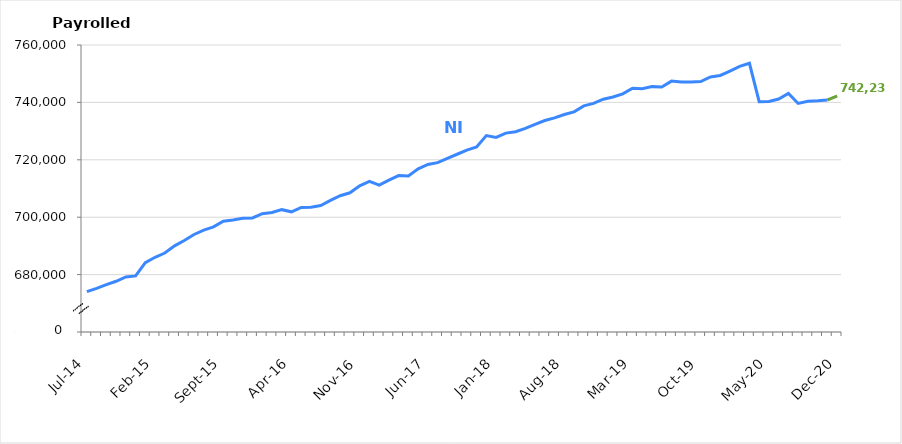
| Category | NI |
|---|---|
| Jul-14 | 674068 |
| Aug-14 | 675212 |
| Sep-14 | 676507 |
| Oct-14 | 677683 |
| Nov-14 | 679179 |
| Dec-14 | 679531 |
| Jan-15 | 684168 |
| Feb-15 | 686037 |
| Mar-15 | 687511 |
| Apr-15 | 690005 |
| May-15 | 691861 |
| Jun-15 | 693988 |
| Jul-15 | 695522 |
| Aug-15 | 696615 |
| Sep-15 | 698608 |
| Oct-15 | 698996 |
| Nov-15 | 699656 |
| Dec-15 | 699750 |
| Jan-16 | 701209 |
| Feb-16 | 701628 |
| Mar-16 | 702623 |
| Apr-16 | 701879 |
| May-16 | 703379 |
| Jun-16 | 703442 |
| Jul-16 | 704084 |
| Aug-16 | 705853 |
| Sep-16 | 707472 |
| Oct-16 | 708510 |
| Nov-16 | 710941 |
| Dec-16 | 712450 |
| Jan-17 | 711188 |
| Feb-17 | 712920 |
| Mar-17 | 714506 |
| Apr-17 | 714367 |
| May-17 | 716840 |
| Jun-17 | 718380 |
| Jul-17 | 718997 |
| Aug-17 | 720509 |
| Sep-17 | 721934 |
| Oct-17 | 723392 |
| Nov-17 | 724451 |
| Dec-17 | 728457 |
| Jan-18 | 727807 |
| Feb-18 | 729297 |
| Mar-18 | 729772 |
| Apr-18 | 730917 |
| May-18 | 732372 |
| Jun-18 | 733698 |
| Jul-18 | 734598 |
| Aug-18 | 735797 |
| Sep-18 | 736710 |
| Oct-18 | 738787 |
| Nov-18 | 739651 |
| Dec-18 | 741120 |
| Jan-19 | 741882 |
| Feb-19 | 742982 |
| Mar-19 | 744918 |
| Apr-19 | 744788 |
| May-19 | 745495 |
| Jun-19 | 745396 |
| Jul-19 | 747424 |
| Aug-19 | 747070 |
| Sep-19 | 747081 |
| Oct-19 | 747280 |
| Nov-19 | 748879 |
| Dec-19 | 749393 |
| Jan-20 | 750933 |
| Feb-20 | 752554 |
| Mar-20 | 753638 |
| Apr-20 | 740252 |
| May-20 | 740342 |
| Jun-20 | 741164 |
| Jul-20 | 743101 |
| Aug-20 | 739641 |
| Sep-20 | 740383 |
| Oct-20 | 740559 |
| Nov-20 | 740835 |
| Dec-20 | 742234 |